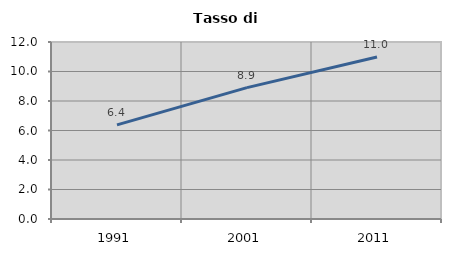
| Category | Tasso di disoccupazione   |
|---|---|
| 1991.0 | 6.383 |
| 2001.0 | 8.907 |
| 2011.0 | 10.985 |